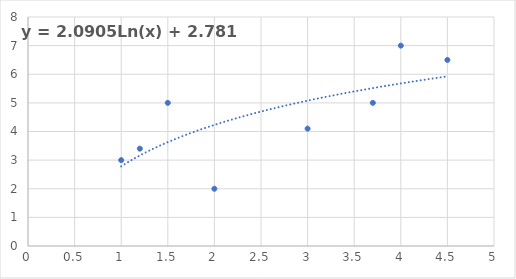
| Category | Series 0 |
|---|---|
| 1.0 | 3 |
| 1.2 | 3.4 |
| 1.5 | 5 |
| 2.0 | 2 |
| 3.0 | 4.1 |
| 3.7 | 5 |
| 4.0 | 7 |
| 4.5 | 6.5 |